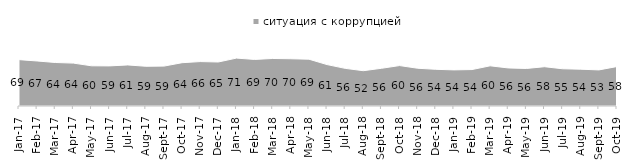
| Category | ситуация с коррупцией |
|---|---|
| 2017-01-01 | 68.7 |
| 2017-02-01 | 66.7 |
| 2017-03-01 | 64.45 |
| 2017-04-01 | 63.55 |
| 2017-05-01 | 59.55 |
| 2017-06-01 | 59.4 |
| 2017-07-01 | 60.85 |
| 2017-08-01 | 58.85 |
| 2017-09-01 | 59.1 |
| 2017-10-01 | 64.15 |
| 2017-11-01 | 65.8 |
| 2017-12-01 | 65.2 |
| 2018-01-01 | 70.95 |
| 2018-02-01 | 69 |
| 2018-03-01 | 70.4 |
| 2018-04-01 | 70 |
| 2018-05-01 | 69.35 |
| 2018-06-01 | 61.35 |
| 2018-07-01 | 55.75 |
| 2018-08-01 | 52.3 |
| 2018-09-01 | 55.85 |
| 2018-10-01 | 59.9 |
| 2018-11-01 | 55.938 |
| 2018-12-01 | 54.35 |
| 2019-01-01 | 53.5 |
| 2019-02-01 | 54 |
| 2019-03-01 | 59.523 |
| 2019-04-01 | 56.386 |
| 2019-05-01 | 55.622 |
| 2019-06-01 | 58.204 |
| 2019-07-01 | 55.149 |
| 2019-08-01 | 54.496 |
| 2019-09-01 | 53.465 |
| 2019-10-01 | 58.465 |